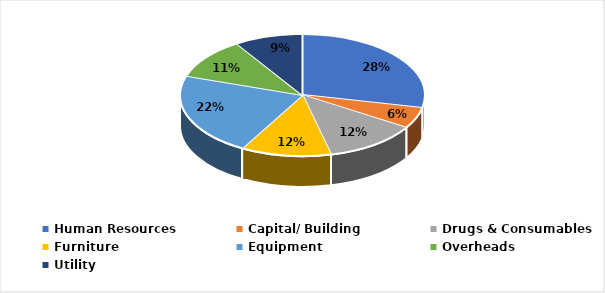
| Category | Share of Time |
|---|---|
| Human Resources | 0.284 |
| Capital/ Building | 0.056 |
| Drugs & Consumables | 0.123 |
| Furniture | 0.119 |
| Equipment | 0.219 |
| Overheads | 0.109 |
| Utility | 0.09 |